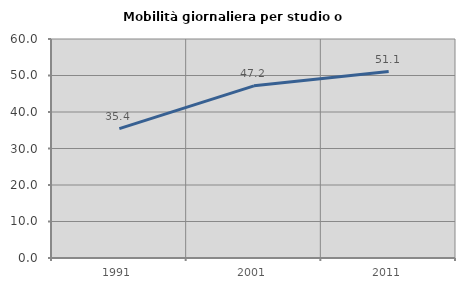
| Category | Mobilità giornaliera per studio o lavoro |
|---|---|
| 1991.0 | 35.429 |
| 2001.0 | 47.165 |
| 2011.0 | 51.073 |